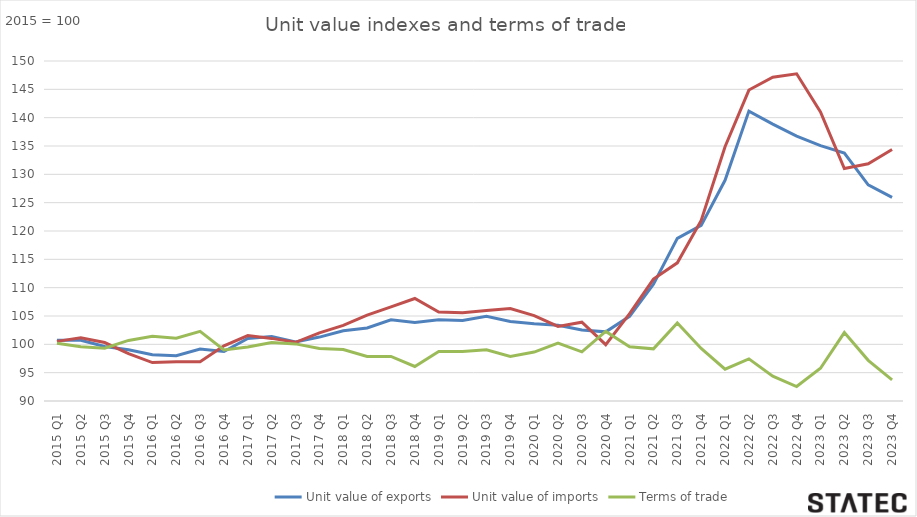
| Category | Unit value of exports | Unit value of imports | Terms of trade |
|---|---|---|---|
| 2015 Q1 | 100.729 | 100.52 | 100.209 |
| 2015 Q2 | 100.722 | 101.159 | 99.567 |
| 2015 Q3 | 99.623 | 100.313 | 99.312 |
| 2015 Q4 | 99.044 | 98.362 | 100.693 |
| 2016 Q1 | 98.148 | 96.775 | 101.418 |
| 2016 Q2 | 97.999 | 96.946 | 101.086 |
| 2016 Q3 | 99.156 | 96.939 | 102.287 |
| 2016 Q4 | 98.746 | 99.742 | 99.001 |
| 2017 Q1 | 101.047 | 101.541 | 99.514 |
| 2017 Q2 | 101.37 | 101.049 | 100.317 |
| 2017 Q3 | 100.439 | 100.362 | 100.076 |
| 2017 Q4 | 101.279 | 102.035 | 99.259 |
| 2018 Q1 | 102.409 | 103.341 | 99.098 |
| 2018 Q2 | 102.896 | 105.143 | 97.863 |
| 2018 Q3 | 104.318 | 106.598 | 97.861 |
| 2018 Q4 | 103.872 | 108.092 | 96.097 |
| 2019 Q1 | 104.336 | 105.687 | 98.722 |
| 2019 Q2 | 104.196 | 105.553 | 98.715 |
| 2019 Q3 | 104.959 | 105.972 | 99.044 |
| 2019 Q4 | 104.042 | 106.305 | 97.871 |
| 2020 Q1 | 103.636 | 105.076 | 98.63 |
| 2020 Q2 | 103.382 | 103.155 | 100.221 |
| 2020 Q3 | 102.53 | 103.914 | 98.668 |
| 2020 Q4 | 102.204 | 99.938 | 102.268 |
| 2021 Q1 | 104.942 | 105.413 | 99.553 |
| 2021 Q2 | 110.615 | 111.507 | 99.2 |
| 2021 Q3 | 118.691 | 114.382 | 103.767 |
| 2021 Q4 | 120.986 | 121.87 | 99.274 |
| 2022 Q1 | 128.951 | 134.864 | 95.616 |
| 2022 Q2 | 141.155 | 144.874 | 97.433 |
| 2022 Q3 | 138.871 | 147.132 | 94.385 |
| 2022 Q4 | 136.73 | 147.737 | 92.549 |
| 2023 Q1 | 135.056 | 140.998 | 95.786 |
| 2023 Q2 | 133.754 | 131.031 | 102.078 |
| 2023 Q3 | 128.15 | 131.874 | 97.176 |
| 2023 Q4 | 125.947 | 134.376 | 93.727 |